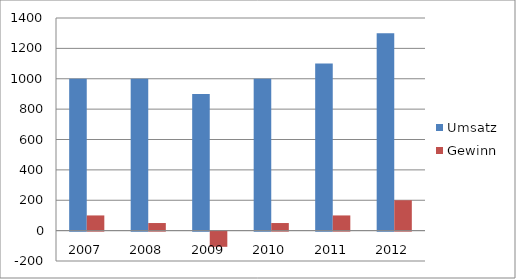
| Category | Umsatz | Gewinn |
|---|---|---|
| 2007.0 | 1000 | 100 |
| 2008.0 | 1000 | 50 |
| 2009.0 | 900 | -100 |
| 2010.0 | 1000 | 50 |
| 2011.0 | 1100 | 100 |
| 2012.0 | 1300 | 200 |